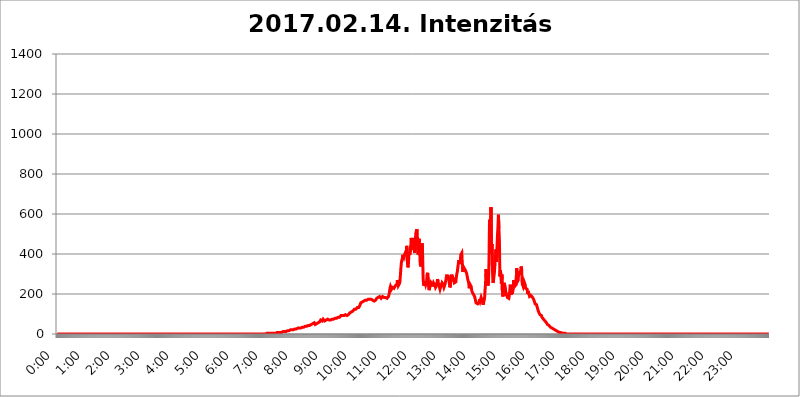
| Category | 2017.02.14. Intenzitás [W/m^2] |
|---|---|
| 0.0 | 0 |
| 0.0006944444444444445 | 0 |
| 0.001388888888888889 | 0 |
| 0.0020833333333333333 | 0 |
| 0.002777777777777778 | 0 |
| 0.003472222222222222 | 0 |
| 0.004166666666666667 | 0 |
| 0.004861111111111111 | 0 |
| 0.005555555555555556 | 0 |
| 0.0062499999999999995 | 0 |
| 0.006944444444444444 | 0 |
| 0.007638888888888889 | 0 |
| 0.008333333333333333 | 0 |
| 0.009027777777777779 | 0 |
| 0.009722222222222222 | 0 |
| 0.010416666666666666 | 0 |
| 0.011111111111111112 | 0 |
| 0.011805555555555555 | 0 |
| 0.012499999999999999 | 0 |
| 0.013194444444444444 | 0 |
| 0.013888888888888888 | 0 |
| 0.014583333333333332 | 0 |
| 0.015277777777777777 | 0 |
| 0.015972222222222224 | 0 |
| 0.016666666666666666 | 0 |
| 0.017361111111111112 | 0 |
| 0.018055555555555557 | 0 |
| 0.01875 | 0 |
| 0.019444444444444445 | 0 |
| 0.02013888888888889 | 0 |
| 0.020833333333333332 | 0 |
| 0.02152777777777778 | 0 |
| 0.022222222222222223 | 0 |
| 0.02291666666666667 | 0 |
| 0.02361111111111111 | 0 |
| 0.024305555555555556 | 0 |
| 0.024999999999999998 | 0 |
| 0.025694444444444447 | 0 |
| 0.02638888888888889 | 0 |
| 0.027083333333333334 | 0 |
| 0.027777777777777776 | 0 |
| 0.02847222222222222 | 0 |
| 0.029166666666666664 | 0 |
| 0.029861111111111113 | 0 |
| 0.030555555555555555 | 0 |
| 0.03125 | 0 |
| 0.03194444444444445 | 0 |
| 0.03263888888888889 | 0 |
| 0.03333333333333333 | 0 |
| 0.034027777777777775 | 0 |
| 0.034722222222222224 | 0 |
| 0.035416666666666666 | 0 |
| 0.036111111111111115 | 0 |
| 0.03680555555555556 | 0 |
| 0.0375 | 0 |
| 0.03819444444444444 | 0 |
| 0.03888888888888889 | 0 |
| 0.03958333333333333 | 0 |
| 0.04027777777777778 | 0 |
| 0.04097222222222222 | 0 |
| 0.041666666666666664 | 0 |
| 0.042361111111111106 | 0 |
| 0.04305555555555556 | 0 |
| 0.043750000000000004 | 0 |
| 0.044444444444444446 | 0 |
| 0.04513888888888889 | 0 |
| 0.04583333333333334 | 0 |
| 0.04652777777777778 | 0 |
| 0.04722222222222222 | 0 |
| 0.04791666666666666 | 0 |
| 0.04861111111111111 | 0 |
| 0.049305555555555554 | 0 |
| 0.049999999999999996 | 0 |
| 0.05069444444444445 | 0 |
| 0.051388888888888894 | 0 |
| 0.052083333333333336 | 0 |
| 0.05277777777777778 | 0 |
| 0.05347222222222222 | 0 |
| 0.05416666666666667 | 0 |
| 0.05486111111111111 | 0 |
| 0.05555555555555555 | 0 |
| 0.05625 | 0 |
| 0.05694444444444444 | 0 |
| 0.057638888888888885 | 0 |
| 0.05833333333333333 | 0 |
| 0.05902777777777778 | 0 |
| 0.059722222222222225 | 0 |
| 0.06041666666666667 | 0 |
| 0.061111111111111116 | 0 |
| 0.06180555555555556 | 0 |
| 0.0625 | 0 |
| 0.06319444444444444 | 0 |
| 0.06388888888888888 | 0 |
| 0.06458333333333334 | 0 |
| 0.06527777777777778 | 0 |
| 0.06597222222222222 | 0 |
| 0.06666666666666667 | 0 |
| 0.06736111111111111 | 0 |
| 0.06805555555555555 | 0 |
| 0.06874999999999999 | 0 |
| 0.06944444444444443 | 0 |
| 0.07013888888888889 | 0 |
| 0.07083333333333333 | 0 |
| 0.07152777777777779 | 0 |
| 0.07222222222222223 | 0 |
| 0.07291666666666667 | 0 |
| 0.07361111111111111 | 0 |
| 0.07430555555555556 | 0 |
| 0.075 | 0 |
| 0.07569444444444444 | 0 |
| 0.0763888888888889 | 0 |
| 0.07708333333333334 | 0 |
| 0.07777777777777778 | 0 |
| 0.07847222222222222 | 0 |
| 0.07916666666666666 | 0 |
| 0.0798611111111111 | 0 |
| 0.08055555555555556 | 0 |
| 0.08125 | 0 |
| 0.08194444444444444 | 0 |
| 0.08263888888888889 | 0 |
| 0.08333333333333333 | 0 |
| 0.08402777777777777 | 0 |
| 0.08472222222222221 | 0 |
| 0.08541666666666665 | 0 |
| 0.08611111111111112 | 0 |
| 0.08680555555555557 | 0 |
| 0.08750000000000001 | 0 |
| 0.08819444444444445 | 0 |
| 0.08888888888888889 | 0 |
| 0.08958333333333333 | 0 |
| 0.09027777777777778 | 0 |
| 0.09097222222222222 | 0 |
| 0.09166666666666667 | 0 |
| 0.09236111111111112 | 0 |
| 0.09305555555555556 | 0 |
| 0.09375 | 0 |
| 0.09444444444444444 | 0 |
| 0.09513888888888888 | 0 |
| 0.09583333333333333 | 0 |
| 0.09652777777777777 | 0 |
| 0.09722222222222222 | 0 |
| 0.09791666666666667 | 0 |
| 0.09861111111111111 | 0 |
| 0.09930555555555555 | 0 |
| 0.09999999999999999 | 0 |
| 0.10069444444444443 | 0 |
| 0.1013888888888889 | 0 |
| 0.10208333333333335 | 0 |
| 0.10277777777777779 | 0 |
| 0.10347222222222223 | 0 |
| 0.10416666666666667 | 0 |
| 0.10486111111111111 | 0 |
| 0.10555555555555556 | 0 |
| 0.10625 | 0 |
| 0.10694444444444444 | 0 |
| 0.1076388888888889 | 0 |
| 0.10833333333333334 | 0 |
| 0.10902777777777778 | 0 |
| 0.10972222222222222 | 0 |
| 0.1111111111111111 | 0 |
| 0.11180555555555556 | 0 |
| 0.11180555555555556 | 0 |
| 0.1125 | 0 |
| 0.11319444444444444 | 0 |
| 0.11388888888888889 | 0 |
| 0.11458333333333333 | 0 |
| 0.11527777777777777 | 0 |
| 0.11597222222222221 | 0 |
| 0.11666666666666665 | 0 |
| 0.1173611111111111 | 0 |
| 0.11805555555555557 | 0 |
| 0.11944444444444445 | 0 |
| 0.12013888888888889 | 0 |
| 0.12083333333333333 | 0 |
| 0.12152777777777778 | 0 |
| 0.12222222222222223 | 0 |
| 0.12291666666666667 | 0 |
| 0.12291666666666667 | 0 |
| 0.12361111111111112 | 0 |
| 0.12430555555555556 | 0 |
| 0.125 | 0 |
| 0.12569444444444444 | 0 |
| 0.12638888888888888 | 0 |
| 0.12708333333333333 | 0 |
| 0.16875 | 0 |
| 0.12847222222222224 | 0 |
| 0.12916666666666668 | 0 |
| 0.12986111111111112 | 0 |
| 0.13055555555555556 | 0 |
| 0.13125 | 0 |
| 0.13194444444444445 | 0 |
| 0.1326388888888889 | 0 |
| 0.13333333333333333 | 0 |
| 0.13402777777777777 | 0 |
| 0.13402777777777777 | 0 |
| 0.13472222222222222 | 0 |
| 0.13541666666666666 | 0 |
| 0.1361111111111111 | 0 |
| 0.13749999999999998 | 0 |
| 0.13819444444444443 | 0 |
| 0.1388888888888889 | 0 |
| 0.13958333333333334 | 0 |
| 0.14027777777777778 | 0 |
| 0.14097222222222222 | 0 |
| 0.14166666666666666 | 0 |
| 0.1423611111111111 | 0 |
| 0.14305555555555557 | 0 |
| 0.14375000000000002 | 0 |
| 0.14444444444444446 | 0 |
| 0.1451388888888889 | 0 |
| 0.1451388888888889 | 0 |
| 0.14652777777777778 | 0 |
| 0.14722222222222223 | 0 |
| 0.14791666666666667 | 0 |
| 0.1486111111111111 | 0 |
| 0.14930555555555555 | 0 |
| 0.15 | 0 |
| 0.15069444444444444 | 0 |
| 0.15138888888888888 | 0 |
| 0.15208333333333332 | 0 |
| 0.15277777777777776 | 0 |
| 0.15347222222222223 | 0 |
| 0.15416666666666667 | 0 |
| 0.15486111111111112 | 0 |
| 0.15555555555555556 | 0 |
| 0.15625 | 0 |
| 0.15694444444444444 | 0 |
| 0.15763888888888888 | 0 |
| 0.15833333333333333 | 0 |
| 0.15902777777777777 | 0 |
| 0.15972222222222224 | 0 |
| 0.16041666666666668 | 0 |
| 0.16111111111111112 | 0 |
| 0.16180555555555556 | 0 |
| 0.1625 | 0 |
| 0.16319444444444445 | 0 |
| 0.1638888888888889 | 0 |
| 0.16458333333333333 | 0 |
| 0.16527777777777777 | 0 |
| 0.16597222222222222 | 0 |
| 0.16666666666666666 | 0 |
| 0.1673611111111111 | 0 |
| 0.16805555555555554 | 0 |
| 0.16874999999999998 | 0 |
| 0.16944444444444443 | 0 |
| 0.17013888888888887 | 0 |
| 0.1708333333333333 | 0 |
| 0.17152777777777775 | 0 |
| 0.17222222222222225 | 0 |
| 0.1729166666666667 | 0 |
| 0.17361111111111113 | 0 |
| 0.17430555555555557 | 0 |
| 0.17500000000000002 | 0 |
| 0.17569444444444446 | 0 |
| 0.1763888888888889 | 0 |
| 0.17708333333333334 | 0 |
| 0.17777777777777778 | 0 |
| 0.17847222222222223 | 0 |
| 0.17916666666666667 | 0 |
| 0.1798611111111111 | 0 |
| 0.18055555555555555 | 0 |
| 0.18125 | 0 |
| 0.18194444444444444 | 0 |
| 0.1826388888888889 | 0 |
| 0.18333333333333335 | 0 |
| 0.1840277777777778 | 0 |
| 0.18472222222222223 | 0 |
| 0.18541666666666667 | 0 |
| 0.18611111111111112 | 0 |
| 0.18680555555555556 | 0 |
| 0.1875 | 0 |
| 0.18819444444444444 | 0 |
| 0.18888888888888888 | 0 |
| 0.18958333333333333 | 0 |
| 0.19027777777777777 | 0 |
| 0.1909722222222222 | 0 |
| 0.19166666666666665 | 0 |
| 0.19236111111111112 | 0 |
| 0.19305555555555554 | 0 |
| 0.19375 | 0 |
| 0.19444444444444445 | 0 |
| 0.1951388888888889 | 0 |
| 0.19583333333333333 | 0 |
| 0.19652777777777777 | 0 |
| 0.19722222222222222 | 0 |
| 0.19791666666666666 | 0 |
| 0.1986111111111111 | 0 |
| 0.19930555555555554 | 0 |
| 0.19999999999999998 | 0 |
| 0.20069444444444443 | 0 |
| 0.20138888888888887 | 0 |
| 0.2020833333333333 | 0 |
| 0.2027777777777778 | 0 |
| 0.2034722222222222 | 0 |
| 0.2041666666666667 | 0 |
| 0.20486111111111113 | 0 |
| 0.20555555555555557 | 0 |
| 0.20625000000000002 | 0 |
| 0.20694444444444446 | 0 |
| 0.2076388888888889 | 0 |
| 0.20833333333333334 | 0 |
| 0.20902777777777778 | 0 |
| 0.20972222222222223 | 0 |
| 0.21041666666666667 | 0 |
| 0.2111111111111111 | 0 |
| 0.21180555555555555 | 0 |
| 0.2125 | 0 |
| 0.21319444444444444 | 0 |
| 0.2138888888888889 | 0 |
| 0.21458333333333335 | 0 |
| 0.2152777777777778 | 0 |
| 0.21597222222222223 | 0 |
| 0.21666666666666667 | 0 |
| 0.21736111111111112 | 0 |
| 0.21805555555555556 | 0 |
| 0.21875 | 0 |
| 0.21944444444444444 | 0 |
| 0.22013888888888888 | 0 |
| 0.22083333333333333 | 0 |
| 0.22152777777777777 | 0 |
| 0.2222222222222222 | 0 |
| 0.22291666666666665 | 0 |
| 0.2236111111111111 | 0 |
| 0.22430555555555556 | 0 |
| 0.225 | 0 |
| 0.22569444444444445 | 0 |
| 0.2263888888888889 | 0 |
| 0.22708333333333333 | 0 |
| 0.22777777777777777 | 0 |
| 0.22847222222222222 | 0 |
| 0.22916666666666666 | 0 |
| 0.2298611111111111 | 0 |
| 0.23055555555555554 | 0 |
| 0.23124999999999998 | 0 |
| 0.23194444444444443 | 0 |
| 0.23263888888888887 | 0 |
| 0.2333333333333333 | 0 |
| 0.2340277777777778 | 0 |
| 0.2347222222222222 | 0 |
| 0.2354166666666667 | 0 |
| 0.23611111111111113 | 0 |
| 0.23680555555555557 | 0 |
| 0.23750000000000002 | 0 |
| 0.23819444444444446 | 0 |
| 0.2388888888888889 | 0 |
| 0.23958333333333334 | 0 |
| 0.24027777777777778 | 0 |
| 0.24097222222222223 | 0 |
| 0.24166666666666667 | 0 |
| 0.2423611111111111 | 0 |
| 0.24305555555555555 | 0 |
| 0.24375 | 0 |
| 0.24444444444444446 | 0 |
| 0.24513888888888888 | 0 |
| 0.24583333333333335 | 0 |
| 0.2465277777777778 | 0 |
| 0.24722222222222223 | 0 |
| 0.24791666666666667 | 0 |
| 0.24861111111111112 | 0 |
| 0.24930555555555556 | 0 |
| 0.25 | 0 |
| 0.25069444444444444 | 0 |
| 0.2513888888888889 | 0 |
| 0.2520833333333333 | 0 |
| 0.25277777777777777 | 0 |
| 0.2534722222222222 | 0 |
| 0.25416666666666665 | 0 |
| 0.2548611111111111 | 0 |
| 0.2555555555555556 | 0 |
| 0.25625000000000003 | 0 |
| 0.2569444444444445 | 0 |
| 0.2576388888888889 | 0 |
| 0.25833333333333336 | 0 |
| 0.2590277777777778 | 0 |
| 0.25972222222222224 | 0 |
| 0.2604166666666667 | 0 |
| 0.2611111111111111 | 0 |
| 0.26180555555555557 | 0 |
| 0.2625 | 0 |
| 0.26319444444444445 | 0 |
| 0.2638888888888889 | 0 |
| 0.26458333333333334 | 0 |
| 0.2652777777777778 | 0 |
| 0.2659722222222222 | 0 |
| 0.26666666666666666 | 0 |
| 0.2673611111111111 | 0 |
| 0.26805555555555555 | 0 |
| 0.26875 | 0 |
| 0.26944444444444443 | 0 |
| 0.2701388888888889 | 0 |
| 0.2708333333333333 | 0 |
| 0.27152777777777776 | 0 |
| 0.2722222222222222 | 0 |
| 0.27291666666666664 | 0 |
| 0.2736111111111111 | 0 |
| 0.2743055555555555 | 0 |
| 0.27499999999999997 | 0 |
| 0.27569444444444446 | 0 |
| 0.27638888888888885 | 0 |
| 0.27708333333333335 | 0 |
| 0.2777777777777778 | 0 |
| 0.27847222222222223 | 0 |
| 0.2791666666666667 | 0 |
| 0.2798611111111111 | 0 |
| 0.28055555555555556 | 0 |
| 0.28125 | 0 |
| 0.28194444444444444 | 0 |
| 0.2826388888888889 | 0 |
| 0.2833333333333333 | 0 |
| 0.28402777777777777 | 0 |
| 0.2847222222222222 | 0 |
| 0.28541666666666665 | 0 |
| 0.28611111111111115 | 0 |
| 0.28680555555555554 | 0 |
| 0.28750000000000003 | 0 |
| 0.2881944444444445 | 0 |
| 0.2888888888888889 | 0 |
| 0.28958333333333336 | 0 |
| 0.2902777777777778 | 0 |
| 0.29097222222222224 | 0 |
| 0.2916666666666667 | 0 |
| 0.2923611111111111 | 0 |
| 0.29305555555555557 | 0 |
| 0.29375 | 3.525 |
| 0.29444444444444445 | 0 |
| 0.2951388888888889 | 0 |
| 0.29583333333333334 | 3.525 |
| 0.2965277777777778 | 3.525 |
| 0.2972222222222222 | 3.525 |
| 0.29791666666666666 | 3.525 |
| 0.2986111111111111 | 3.525 |
| 0.29930555555555555 | 3.525 |
| 0.3 | 3.525 |
| 0.30069444444444443 | 3.525 |
| 0.3013888888888889 | 3.525 |
| 0.3020833333333333 | 3.525 |
| 0.30277777777777776 | 3.525 |
| 0.3034722222222222 | 3.525 |
| 0.30416666666666664 | 3.525 |
| 0.3048611111111111 | 3.525 |
| 0.3055555555555555 | 3.525 |
| 0.30624999999999997 | 3.525 |
| 0.3069444444444444 | 3.525 |
| 0.3076388888888889 | 3.525 |
| 0.30833333333333335 | 7.887 |
| 0.3090277777777778 | 7.887 |
| 0.30972222222222223 | 7.887 |
| 0.3104166666666667 | 7.887 |
| 0.3111111111111111 | 7.887 |
| 0.31180555555555556 | 7.887 |
| 0.3125 | 7.887 |
| 0.31319444444444444 | 7.887 |
| 0.3138888888888889 | 7.887 |
| 0.3145833333333333 | 7.887 |
| 0.31527777777777777 | 7.887 |
| 0.3159722222222222 | 12.257 |
| 0.31666666666666665 | 12.257 |
| 0.31736111111111115 | 12.257 |
| 0.31805555555555554 | 12.257 |
| 0.31875000000000003 | 12.257 |
| 0.3194444444444445 | 12.257 |
| 0.3201388888888889 | 12.257 |
| 0.32083333333333336 | 12.257 |
| 0.3215277777777778 | 16.636 |
| 0.32222222222222224 | 16.636 |
| 0.3229166666666667 | 16.636 |
| 0.3236111111111111 | 16.636 |
| 0.32430555555555557 | 16.636 |
| 0.325 | 16.636 |
| 0.32569444444444445 | 21.024 |
| 0.3263888888888889 | 16.636 |
| 0.32708333333333334 | 21.024 |
| 0.3277777777777778 | 21.024 |
| 0.3284722222222222 | 21.024 |
| 0.32916666666666666 | 21.024 |
| 0.3298611111111111 | 21.024 |
| 0.33055555555555555 | 21.024 |
| 0.33125 | 21.024 |
| 0.33194444444444443 | 25.419 |
| 0.3326388888888889 | 25.419 |
| 0.3333333333333333 | 25.419 |
| 0.3340277777777778 | 25.419 |
| 0.3347222222222222 | 25.419 |
| 0.3354166666666667 | 25.419 |
| 0.3361111111111111 | 25.419 |
| 0.3368055555555556 | 29.823 |
| 0.33749999999999997 | 29.823 |
| 0.33819444444444446 | 29.823 |
| 0.33888888888888885 | 29.823 |
| 0.33958333333333335 | 29.823 |
| 0.34027777777777773 | 29.823 |
| 0.34097222222222223 | 29.823 |
| 0.3416666666666666 | 29.823 |
| 0.3423611111111111 | 29.823 |
| 0.3430555555555555 | 29.823 |
| 0.34375 | 34.234 |
| 0.3444444444444445 | 34.234 |
| 0.3451388888888889 | 34.234 |
| 0.3458333333333334 | 34.234 |
| 0.34652777777777777 | 38.653 |
| 0.34722222222222227 | 38.653 |
| 0.34791666666666665 | 38.653 |
| 0.34861111111111115 | 38.653 |
| 0.34930555555555554 | 38.653 |
| 0.35000000000000003 | 38.653 |
| 0.3506944444444444 | 38.653 |
| 0.3513888888888889 | 38.653 |
| 0.3520833333333333 | 43.079 |
| 0.3527777777777778 | 43.079 |
| 0.3534722222222222 | 43.079 |
| 0.3541666666666667 | 43.079 |
| 0.3548611111111111 | 43.079 |
| 0.35555555555555557 | 43.079 |
| 0.35625 | 47.511 |
| 0.35694444444444445 | 51.951 |
| 0.3576388888888889 | 51.951 |
| 0.35833333333333334 | 51.951 |
| 0.3590277777777778 | 51.951 |
| 0.3597222222222222 | 51.951 |
| 0.36041666666666666 | 56.398 |
| 0.3611111111111111 | 51.951 |
| 0.36180555555555555 | 47.511 |
| 0.3625 | 47.511 |
| 0.36319444444444443 | 47.511 |
| 0.3638888888888889 | 51.951 |
| 0.3645833333333333 | 56.398 |
| 0.3652777777777778 | 56.398 |
| 0.3659722222222222 | 56.398 |
| 0.3666666666666667 | 60.85 |
| 0.3673611111111111 | 60.85 |
| 0.3680555555555556 | 60.85 |
| 0.36874999999999997 | 65.31 |
| 0.36944444444444446 | 69.775 |
| 0.37013888888888885 | 65.31 |
| 0.37083333333333335 | 65.31 |
| 0.37152777777777773 | 65.31 |
| 0.37222222222222223 | 65.31 |
| 0.3729166666666666 | 74.246 |
| 0.3736111111111111 | 74.246 |
| 0.3743055555555555 | 69.775 |
| 0.375 | 65.31 |
| 0.3756944444444445 | 65.31 |
| 0.3763888888888889 | 69.775 |
| 0.3770833333333334 | 69.775 |
| 0.37777777777777777 | 69.775 |
| 0.37847222222222227 | 74.246 |
| 0.37916666666666665 | 74.246 |
| 0.37986111111111115 | 69.775 |
| 0.38055555555555554 | 69.775 |
| 0.38125000000000003 | 69.775 |
| 0.3819444444444444 | 69.775 |
| 0.3826388888888889 | 69.775 |
| 0.3833333333333333 | 69.775 |
| 0.3840277777777778 | 69.775 |
| 0.3847222222222222 | 74.246 |
| 0.3854166666666667 | 74.246 |
| 0.3861111111111111 | 74.246 |
| 0.38680555555555557 | 74.246 |
| 0.3875 | 74.246 |
| 0.38819444444444445 | 74.246 |
| 0.3888888888888889 | 78.722 |
| 0.38958333333333334 | 78.722 |
| 0.3902777777777778 | 78.722 |
| 0.3909722222222222 | 78.722 |
| 0.39166666666666666 | 78.722 |
| 0.3923611111111111 | 78.722 |
| 0.39305555555555555 | 83.205 |
| 0.39375 | 83.205 |
| 0.39444444444444443 | 83.205 |
| 0.3951388888888889 | 83.205 |
| 0.3958333333333333 | 83.205 |
| 0.3965277777777778 | 83.205 |
| 0.3972222222222222 | 87.692 |
| 0.3979166666666667 | 92.184 |
| 0.3986111111111111 | 92.184 |
| 0.3993055555555556 | 92.184 |
| 0.39999999999999997 | 92.184 |
| 0.40069444444444446 | 92.184 |
| 0.40138888888888885 | 92.184 |
| 0.40208333333333335 | 92.184 |
| 0.40277777777777773 | 96.682 |
| 0.40347222222222223 | 96.682 |
| 0.4041666666666666 | 96.682 |
| 0.4048611111111111 | 96.682 |
| 0.4055555555555555 | 92.184 |
| 0.40625 | 92.184 |
| 0.4069444444444445 | 96.682 |
| 0.4076388888888889 | 96.682 |
| 0.4083333333333334 | 96.682 |
| 0.40902777777777777 | 96.682 |
| 0.40972222222222227 | 101.184 |
| 0.41041666666666665 | 105.69 |
| 0.41111111111111115 | 105.69 |
| 0.41180555555555554 | 110.201 |
| 0.41250000000000003 | 110.201 |
| 0.4131944444444444 | 110.201 |
| 0.4138888888888889 | 114.716 |
| 0.4145833333333333 | 114.716 |
| 0.4152777777777778 | 114.716 |
| 0.4159722222222222 | 119.235 |
| 0.4166666666666667 | 123.758 |
| 0.4173611111111111 | 123.758 |
| 0.41805555555555557 | 123.758 |
| 0.41875 | 123.758 |
| 0.41944444444444445 | 123.758 |
| 0.4201388888888889 | 128.284 |
| 0.42083333333333334 | 132.814 |
| 0.4215277777777778 | 137.347 |
| 0.4222222222222222 | 137.347 |
| 0.42291666666666666 | 132.814 |
| 0.4236111111111111 | 137.347 |
| 0.42430555555555555 | 141.884 |
| 0.425 | 146.423 |
| 0.42569444444444443 | 155.509 |
| 0.4263888888888889 | 160.056 |
| 0.4270833333333333 | 160.056 |
| 0.4277777777777778 | 160.056 |
| 0.4284722222222222 | 164.605 |
| 0.4291666666666667 | 164.605 |
| 0.4298611111111111 | 164.605 |
| 0.4305555555555556 | 164.605 |
| 0.43124999999999997 | 164.605 |
| 0.43194444444444446 | 169.156 |
| 0.43263888888888885 | 169.156 |
| 0.43333333333333335 | 164.605 |
| 0.43402777777777773 | 169.156 |
| 0.43472222222222223 | 169.156 |
| 0.4354166666666666 | 173.709 |
| 0.4361111111111111 | 173.709 |
| 0.4368055555555555 | 173.709 |
| 0.4375 | 173.709 |
| 0.4381944444444445 | 173.709 |
| 0.4388888888888889 | 173.709 |
| 0.4395833333333334 | 173.709 |
| 0.44027777777777777 | 173.709 |
| 0.44097222222222227 | 178.264 |
| 0.44166666666666665 | 173.709 |
| 0.44236111111111115 | 169.156 |
| 0.44305555555555554 | 169.156 |
| 0.44375000000000003 | 164.605 |
| 0.4444444444444444 | 164.605 |
| 0.4451388888888889 | 164.605 |
| 0.4458333333333333 | 169.156 |
| 0.4465277777777778 | 169.156 |
| 0.4472222222222222 | 169.156 |
| 0.4479166666666667 | 178.264 |
| 0.4486111111111111 | 178.264 |
| 0.44930555555555557 | 182.82 |
| 0.45 | 182.82 |
| 0.45069444444444445 | 187.378 |
| 0.4513888888888889 | 187.378 |
| 0.45208333333333334 | 187.378 |
| 0.4527777777777778 | 187.378 |
| 0.4534722222222222 | 187.378 |
| 0.45416666666666666 | 178.264 |
| 0.4548611111111111 | 182.82 |
| 0.45555555555555555 | 182.82 |
| 0.45625 | 187.378 |
| 0.45694444444444443 | 182.82 |
| 0.4576388888888889 | 182.82 |
| 0.4583333333333333 | 182.82 |
| 0.4590277777777778 | 178.264 |
| 0.4597222222222222 | 178.264 |
| 0.4604166666666667 | 182.82 |
| 0.4611111111111111 | 182.82 |
| 0.4618055555555556 | 178.264 |
| 0.46249999999999997 | 178.264 |
| 0.46319444444444446 | 178.264 |
| 0.46388888888888885 | 182.82 |
| 0.46458333333333335 | 187.378 |
| 0.46527777777777773 | 196.497 |
| 0.46597222222222223 | 210.182 |
| 0.4666666666666666 | 228.436 |
| 0.4673611111111111 | 237.564 |
| 0.4680555555555555 | 233 |
| 0.46875 | 223.873 |
| 0.4694444444444445 | 223.873 |
| 0.4701388888888889 | 233 |
| 0.4708333333333334 | 237.564 |
| 0.47152777777777777 | 233 |
| 0.47222222222222227 | 228.436 |
| 0.47291666666666665 | 233 |
| 0.47361111111111115 | 233 |
| 0.47430555555555554 | 242.127 |
| 0.47500000000000003 | 246.689 |
| 0.4756944444444444 | 242.127 |
| 0.4763888888888889 | 246.689 |
| 0.4770833333333333 | 269.49 |
| 0.4777777777777778 | 260.373 |
| 0.4784722222222222 | 242.127 |
| 0.4791666666666667 | 246.689 |
| 0.4798611111111111 | 251.251 |
| 0.48055555555555557 | 260.373 |
| 0.48125 | 292.259 |
| 0.48194444444444445 | 328.584 |
| 0.4826388888888889 | 355.712 |
| 0.48333333333333334 | 369.23 |
| 0.4840277777777778 | 378.224 |
| 0.4847222222222222 | 396.164 |
| 0.48541666666666666 | 396.164 |
| 0.4861111111111111 | 382.715 |
| 0.48680555555555555 | 387.202 |
| 0.4875 | 400.638 |
| 0.48819444444444443 | 405.108 |
| 0.4888888888888889 | 396.164 |
| 0.4895833333333333 | 418.492 |
| 0.4902777777777778 | 440.702 |
| 0.4909722222222222 | 369.23 |
| 0.4916666666666667 | 333.113 |
| 0.4923611111111111 | 342.162 |
| 0.4930555555555556 | 387.202 |
| 0.49374999999999997 | 409.574 |
| 0.49444444444444446 | 396.164 |
| 0.49513888888888885 | 391.685 |
| 0.49583333333333335 | 440.702 |
| 0.49652777777777773 | 480.356 |
| 0.49722222222222223 | 436.27 |
| 0.4979166666666666 | 431.833 |
| 0.4986111111111111 | 480.356 |
| 0.4993055555555555 | 449.551 |
| 0.5 | 418.492 |
| 0.5006944444444444 | 427.39 |
| 0.5013888888888889 | 405.108 |
| 0.5020833333333333 | 431.833 |
| 0.5027777777777778 | 502.192 |
| 0.5034722222222222 | 502.192 |
| 0.5041666666666667 | 523.88 |
| 0.5048611111111111 | 515.223 |
| 0.5055555555555555 | 422.943 |
| 0.50625 | 396.164 |
| 0.5069444444444444 | 440.702 |
| 0.5076388888888889 | 475.972 |
| 0.5083333333333333 | 414.035 |
| 0.5090277777777777 | 351.198 |
| 0.5097222222222222 | 337.639 |
| 0.5104166666666666 | 351.198 |
| 0.5111111111111112 | 373.729 |
| 0.5118055555555555 | 453.968 |
| 0.5125000000000001 | 387.202 |
| 0.5131944444444444 | 278.603 |
| 0.513888888888889 | 242.127 |
| 0.5145833333333333 | 251.251 |
| 0.5152777777777778 | 264.932 |
| 0.5159722222222222 | 264.932 |
| 0.5166666666666667 | 246.689 |
| 0.517361111111111 | 242.127 |
| 0.5180555555555556 | 264.932 |
| 0.5187499999999999 | 296.808 |
| 0.5194444444444445 | 305.898 |
| 0.5201388888888888 | 269.49 |
| 0.5208333333333334 | 237.564 |
| 0.5215277777777778 | 219.309 |
| 0.5222222222222223 | 223.873 |
| 0.5229166666666667 | 242.127 |
| 0.5236111111111111 | 260.373 |
| 0.5243055555555556 | 264.932 |
| 0.525 | 264.932 |
| 0.5256944444444445 | 251.251 |
| 0.5263888888888889 | 237.564 |
| 0.5270833333333333 | 242.127 |
| 0.5277777777777778 | 255.813 |
| 0.5284722222222222 | 260.373 |
| 0.5291666666666667 | 255.813 |
| 0.5298611111111111 | 242.127 |
| 0.5305555555555556 | 233 |
| 0.53125 | 233 |
| 0.5319444444444444 | 242.127 |
| 0.5326388888888889 | 255.813 |
| 0.5333333333333333 | 274.047 |
| 0.5340277777777778 | 264.932 |
| 0.5347222222222222 | 251.251 |
| 0.5354166666666667 | 242.127 |
| 0.5361111111111111 | 233 |
| 0.5368055555555555 | 223.873 |
| 0.5375 | 228.436 |
| 0.5381944444444444 | 242.127 |
| 0.5388888888888889 | 246.689 |
| 0.5395833333333333 | 255.813 |
| 0.5402777777777777 | 255.813 |
| 0.5409722222222222 | 251.251 |
| 0.5416666666666666 | 242.127 |
| 0.5423611111111112 | 233 |
| 0.5430555555555555 | 233 |
| 0.5437500000000001 | 246.689 |
| 0.5444444444444444 | 260.373 |
| 0.545138888888889 | 269.49 |
| 0.5458333333333333 | 287.709 |
| 0.5465277777777778 | 296.808 |
| 0.5472222222222222 | 283.156 |
| 0.5479166666666667 | 292.259 |
| 0.548611111111111 | 292.259 |
| 0.5493055555555556 | 269.49 |
| 0.5499999999999999 | 251.251 |
| 0.5506944444444445 | 233 |
| 0.5513888888888888 | 242.127 |
| 0.5520833333333334 | 274.047 |
| 0.5527777777777778 | 296.808 |
| 0.5534722222222223 | 274.047 |
| 0.5541666666666667 | 269.49 |
| 0.5548611111111111 | 283.156 |
| 0.5555555555555556 | 278.603 |
| 0.55625 | 269.49 |
| 0.5569444444444445 | 255.813 |
| 0.5576388888888889 | 251.251 |
| 0.5583333333333333 | 251.251 |
| 0.5590277777777778 | 260.373 |
| 0.5597222222222222 | 283.156 |
| 0.5604166666666667 | 301.354 |
| 0.5611111111111111 | 310.44 |
| 0.5618055555555556 | 333.113 |
| 0.5625 | 351.198 |
| 0.5631944444444444 | 369.23 |
| 0.5638888888888889 | 351.198 |
| 0.5645833333333333 | 346.682 |
| 0.5652777777777778 | 364.728 |
| 0.5659722222222222 | 396.164 |
| 0.5666666666666667 | 400.638 |
| 0.5673611111111111 | 405.108 |
| 0.5680555555555555 | 355.712 |
| 0.56875 | 310.44 |
| 0.5694444444444444 | 305.898 |
| 0.5701388888888889 | 333.113 |
| 0.5708333333333333 | 333.113 |
| 0.5715277777777777 | 324.052 |
| 0.5722222222222222 | 319.517 |
| 0.5729166666666666 | 314.98 |
| 0.5736111111111112 | 310.44 |
| 0.5743055555555555 | 301.354 |
| 0.5750000000000001 | 301.354 |
| 0.5756944444444444 | 274.047 |
| 0.576388888888889 | 269.49 |
| 0.5770833333333333 | 255.813 |
| 0.5777777777777778 | 228.436 |
| 0.5784722222222222 | 237.564 |
| 0.5791666666666667 | 246.689 |
| 0.579861111111111 | 242.127 |
| 0.5805555555555556 | 237.564 |
| 0.5812499999999999 | 219.309 |
| 0.5819444444444445 | 210.182 |
| 0.5826388888888888 | 210.182 |
| 0.5833333333333334 | 205.62 |
| 0.5840277777777778 | 196.497 |
| 0.5847222222222223 | 191.937 |
| 0.5854166666666667 | 187.378 |
| 0.5861111111111111 | 182.82 |
| 0.5868055555555556 | 164.605 |
| 0.5875 | 155.509 |
| 0.5881944444444445 | 150.964 |
| 0.5888888888888889 | 155.509 |
| 0.5895833333333333 | 150.964 |
| 0.5902777777777778 | 155.509 |
| 0.5909722222222222 | 150.964 |
| 0.5916666666666667 | 160.056 |
| 0.5923611111111111 | 173.709 |
| 0.5930555555555556 | 164.605 |
| 0.59375 | 164.605 |
| 0.5944444444444444 | 182.82 |
| 0.5951388888888889 | 182.82 |
| 0.5958333333333333 | 182.82 |
| 0.5965277777777778 | 160.056 |
| 0.5972222222222222 | 146.423 |
| 0.5979166666666667 | 155.509 |
| 0.5986111111111111 | 155.509 |
| 0.5993055555555555 | 178.264 |
| 0.6 | 219.309 |
| 0.6006944444444444 | 251.251 |
| 0.6013888888888889 | 324.052 |
| 0.6020833333333333 | 269.49 |
| 0.6027777777777777 | 260.373 |
| 0.6034722222222222 | 255.813 |
| 0.6041666666666666 | 242.127 |
| 0.6048611111111112 | 264.932 |
| 0.6055555555555555 | 369.23 |
| 0.6062500000000001 | 571.049 |
| 0.6069444444444444 | 440.702 |
| 0.607638888888889 | 431.833 |
| 0.6083333333333333 | 634.105 |
| 0.6090277777777778 | 400.638 |
| 0.6097222222222222 | 449.551 |
| 0.6104166666666667 | 314.98 |
| 0.611111111111111 | 255.813 |
| 0.6118055555555556 | 264.932 |
| 0.6124999999999999 | 287.709 |
| 0.6131944444444445 | 310.44 |
| 0.6138888888888888 | 346.682 |
| 0.6145833333333334 | 346.682 |
| 0.6152777777777778 | 422.943 |
| 0.6159722222222223 | 360.221 |
| 0.6166666666666667 | 422.943 |
| 0.6173611111111111 | 489.108 |
| 0.6180555555555556 | 532.513 |
| 0.61875 | 596.45 |
| 0.6194444444444445 | 528.2 |
| 0.6201388888888889 | 467.187 |
| 0.6208333333333333 | 287.709 |
| 0.6215277777777778 | 319.517 |
| 0.6222222222222222 | 292.259 |
| 0.6229166666666667 | 251.251 |
| 0.6236111111111111 | 296.808 |
| 0.6243055555555556 | 219.309 |
| 0.625 | 187.378 |
| 0.6256944444444444 | 191.937 |
| 0.6263888888888889 | 237.564 |
| 0.6270833333333333 | 255.813 |
| 0.6277777777777778 | 251.251 |
| 0.6284722222222222 | 219.309 |
| 0.6291666666666667 | 191.937 |
| 0.6298611111111111 | 201.058 |
| 0.6305555555555555 | 191.937 |
| 0.63125 | 182.82 |
| 0.6319444444444444 | 182.82 |
| 0.6326388888888889 | 178.264 |
| 0.6333333333333333 | 178.264 |
| 0.6340277777777777 | 191.937 |
| 0.6347222222222222 | 219.309 |
| 0.6354166666666666 | 246.689 |
| 0.6361111111111112 | 242.127 |
| 0.6368055555555555 | 196.497 |
| 0.6375000000000001 | 210.182 |
| 0.6381944444444444 | 201.058 |
| 0.638888888888889 | 205.62 |
| 0.6395833333333333 | 233 |
| 0.6402777777777778 | 269.49 |
| 0.6409722222222222 | 233 |
| 0.6416666666666667 | 260.373 |
| 0.642361111111111 | 251.251 |
| 0.6430555555555556 | 242.127 |
| 0.6437499999999999 | 278.603 |
| 0.6444444444444445 | 328.584 |
| 0.6451388888888888 | 260.373 |
| 0.6458333333333334 | 264.932 |
| 0.6465277777777778 | 269.49 |
| 0.6472222222222223 | 314.98 |
| 0.6479166666666667 | 296.808 |
| 0.6486111111111111 | 296.808 |
| 0.6493055555555556 | 296.808 |
| 0.65 | 314.98 |
| 0.6506944444444445 | 337.639 |
| 0.6513888888888889 | 319.517 |
| 0.6520833333333333 | 251.251 |
| 0.6527777777777778 | 251.251 |
| 0.6534722222222222 | 237.564 |
| 0.6541666666666667 | 237.564 |
| 0.6548611111111111 | 260.373 |
| 0.6555555555555556 | 260.373 |
| 0.65625 | 246.689 |
| 0.6569444444444444 | 228.436 |
| 0.6576388888888889 | 233 |
| 0.6583333333333333 | 223.873 |
| 0.6590277777777778 | 223.873 |
| 0.6597222222222222 | 201.058 |
| 0.6604166666666667 | 214.746 |
| 0.6611111111111111 | 214.746 |
| 0.6618055555555555 | 196.497 |
| 0.6625 | 187.378 |
| 0.6631944444444444 | 187.378 |
| 0.6638888888888889 | 187.378 |
| 0.6645833333333333 | 191.937 |
| 0.6652777777777777 | 191.937 |
| 0.6659722222222222 | 187.378 |
| 0.6666666666666666 | 182.82 |
| 0.6673611111111111 | 178.264 |
| 0.6680555555555556 | 173.709 |
| 0.6687500000000001 | 173.709 |
| 0.6694444444444444 | 160.056 |
| 0.6701388888888888 | 150.964 |
| 0.6708333333333334 | 150.964 |
| 0.6715277777777778 | 150.964 |
| 0.6722222222222222 | 146.423 |
| 0.6729166666666666 | 141.884 |
| 0.6736111111111112 | 128.284 |
| 0.6743055555555556 | 119.235 |
| 0.6749999999999999 | 114.716 |
| 0.6756944444444444 | 105.69 |
| 0.6763888888888889 | 101.184 |
| 0.6770833333333334 | 96.682 |
| 0.6777777777777777 | 92.184 |
| 0.6784722222222223 | 92.184 |
| 0.6791666666666667 | 92.184 |
| 0.6798611111111111 | 83.205 |
| 0.6805555555555555 | 83.205 |
| 0.68125 | 78.722 |
| 0.6819444444444445 | 74.246 |
| 0.6826388888888889 | 74.246 |
| 0.6833333333333332 | 69.775 |
| 0.6840277777777778 | 65.31 |
| 0.6847222222222222 | 65.31 |
| 0.6854166666666667 | 60.85 |
| 0.686111111111111 | 56.398 |
| 0.6868055555555556 | 51.951 |
| 0.6875 | 47.511 |
| 0.6881944444444444 | 47.511 |
| 0.688888888888889 | 43.079 |
| 0.6895833333333333 | 43.079 |
| 0.6902777777777778 | 38.653 |
| 0.6909722222222222 | 38.653 |
| 0.6916666666666668 | 34.234 |
| 0.6923611111111111 | 34.234 |
| 0.6930555555555555 | 29.823 |
| 0.69375 | 29.823 |
| 0.6944444444444445 | 29.823 |
| 0.6951388888888889 | 25.419 |
| 0.6958333333333333 | 25.419 |
| 0.6965277777777777 | 25.419 |
| 0.6972222222222223 | 21.024 |
| 0.6979166666666666 | 21.024 |
| 0.6986111111111111 | 21.024 |
| 0.6993055555555556 | 16.636 |
| 0.7000000000000001 | 16.636 |
| 0.7006944444444444 | 16.636 |
| 0.7013888888888888 | 12.257 |
| 0.7020833333333334 | 12.257 |
| 0.7027777777777778 | 12.257 |
| 0.7034722222222222 | 12.257 |
| 0.7041666666666666 | 7.887 |
| 0.7048611111111112 | 7.887 |
| 0.7055555555555556 | 7.887 |
| 0.7062499999999999 | 7.887 |
| 0.7069444444444444 | 3.525 |
| 0.7076388888888889 | 3.525 |
| 0.7083333333333334 | 3.525 |
| 0.7090277777777777 | 3.525 |
| 0.7097222222222223 | 3.525 |
| 0.7104166666666667 | 3.525 |
| 0.7111111111111111 | 3.525 |
| 0.7118055555555555 | 3.525 |
| 0.7125 | 3.525 |
| 0.7131944444444445 | 0 |
| 0.7138888888888889 | 0 |
| 0.7145833333333332 | 0 |
| 0.7152777777777778 | 0 |
| 0.7159722222222222 | 0 |
| 0.7166666666666667 | 0 |
| 0.717361111111111 | 0 |
| 0.7180555555555556 | 0 |
| 0.71875 | 0 |
| 0.7194444444444444 | 0 |
| 0.720138888888889 | 0 |
| 0.7208333333333333 | 0 |
| 0.7215277777777778 | 0 |
| 0.7222222222222222 | 0 |
| 0.7229166666666668 | 0 |
| 0.7236111111111111 | 0 |
| 0.7243055555555555 | 0 |
| 0.725 | 0 |
| 0.7256944444444445 | 0 |
| 0.7263888888888889 | 0 |
| 0.7270833333333333 | 0 |
| 0.7277777777777777 | 0 |
| 0.7284722222222223 | 0 |
| 0.7291666666666666 | 0 |
| 0.7298611111111111 | 0 |
| 0.7305555555555556 | 0 |
| 0.7312500000000001 | 0 |
| 0.7319444444444444 | 0 |
| 0.7326388888888888 | 0 |
| 0.7333333333333334 | 0 |
| 0.7340277777777778 | 0 |
| 0.7347222222222222 | 0 |
| 0.7354166666666666 | 0 |
| 0.7361111111111112 | 0 |
| 0.7368055555555556 | 0 |
| 0.7374999999999999 | 0 |
| 0.7381944444444444 | 0 |
| 0.7388888888888889 | 0 |
| 0.7395833333333334 | 0 |
| 0.7402777777777777 | 0 |
| 0.7409722222222223 | 0 |
| 0.7416666666666667 | 0 |
| 0.7423611111111111 | 0 |
| 0.7430555555555555 | 0 |
| 0.74375 | 0 |
| 0.7444444444444445 | 0 |
| 0.7451388888888889 | 0 |
| 0.7458333333333332 | 0 |
| 0.7465277777777778 | 0 |
| 0.7472222222222222 | 0 |
| 0.7479166666666667 | 0 |
| 0.748611111111111 | 0 |
| 0.7493055555555556 | 0 |
| 0.75 | 0 |
| 0.7506944444444444 | 0 |
| 0.751388888888889 | 0 |
| 0.7520833333333333 | 0 |
| 0.7527777777777778 | 0 |
| 0.7534722222222222 | 0 |
| 0.7541666666666668 | 0 |
| 0.7548611111111111 | 0 |
| 0.7555555555555555 | 0 |
| 0.75625 | 0 |
| 0.7569444444444445 | 0 |
| 0.7576388888888889 | 0 |
| 0.7583333333333333 | 0 |
| 0.7590277777777777 | 0 |
| 0.7597222222222223 | 0 |
| 0.7604166666666666 | 0 |
| 0.7611111111111111 | 0 |
| 0.7618055555555556 | 0 |
| 0.7625000000000001 | 0 |
| 0.7631944444444444 | 0 |
| 0.7638888888888888 | 0 |
| 0.7645833333333334 | 0 |
| 0.7652777777777778 | 0 |
| 0.7659722222222222 | 0 |
| 0.7666666666666666 | 0 |
| 0.7673611111111112 | 0 |
| 0.7680555555555556 | 0 |
| 0.7687499999999999 | 0 |
| 0.7694444444444444 | 0 |
| 0.7701388888888889 | 0 |
| 0.7708333333333334 | 0 |
| 0.7715277777777777 | 0 |
| 0.7722222222222223 | 0 |
| 0.7729166666666667 | 0 |
| 0.7736111111111111 | 0 |
| 0.7743055555555555 | 0 |
| 0.775 | 0 |
| 0.7756944444444445 | 0 |
| 0.7763888888888889 | 0 |
| 0.7770833333333332 | 0 |
| 0.7777777777777778 | 0 |
| 0.7784722222222222 | 0 |
| 0.7791666666666667 | 0 |
| 0.779861111111111 | 0 |
| 0.7805555555555556 | 0 |
| 0.78125 | 0 |
| 0.7819444444444444 | 0 |
| 0.782638888888889 | 0 |
| 0.7833333333333333 | 0 |
| 0.7840277777777778 | 0 |
| 0.7847222222222222 | 0 |
| 0.7854166666666668 | 0 |
| 0.7861111111111111 | 0 |
| 0.7868055555555555 | 0 |
| 0.7875 | 0 |
| 0.7881944444444445 | 0 |
| 0.7888888888888889 | 0 |
| 0.7895833333333333 | 0 |
| 0.7902777777777777 | 0 |
| 0.7909722222222223 | 0 |
| 0.7916666666666666 | 0 |
| 0.7923611111111111 | 0 |
| 0.7930555555555556 | 0 |
| 0.7937500000000001 | 0 |
| 0.7944444444444444 | 0 |
| 0.7951388888888888 | 0 |
| 0.7958333333333334 | 0 |
| 0.7965277777777778 | 0 |
| 0.7972222222222222 | 0 |
| 0.7979166666666666 | 0 |
| 0.7986111111111112 | 0 |
| 0.7993055555555556 | 0 |
| 0.7999999999999999 | 0 |
| 0.8006944444444444 | 0 |
| 0.8013888888888889 | 0 |
| 0.8020833333333334 | 0 |
| 0.8027777777777777 | 0 |
| 0.8034722222222223 | 0 |
| 0.8041666666666667 | 0 |
| 0.8048611111111111 | 0 |
| 0.8055555555555555 | 0 |
| 0.80625 | 0 |
| 0.8069444444444445 | 0 |
| 0.8076388888888889 | 0 |
| 0.8083333333333332 | 0 |
| 0.8090277777777778 | 0 |
| 0.8097222222222222 | 0 |
| 0.8104166666666667 | 0 |
| 0.811111111111111 | 0 |
| 0.8118055555555556 | 0 |
| 0.8125 | 0 |
| 0.8131944444444444 | 0 |
| 0.813888888888889 | 0 |
| 0.8145833333333333 | 0 |
| 0.8152777777777778 | 0 |
| 0.8159722222222222 | 0 |
| 0.8166666666666668 | 0 |
| 0.8173611111111111 | 0 |
| 0.8180555555555555 | 0 |
| 0.81875 | 0 |
| 0.8194444444444445 | 0 |
| 0.8201388888888889 | 0 |
| 0.8208333333333333 | 0 |
| 0.8215277777777777 | 0 |
| 0.8222222222222223 | 0 |
| 0.8229166666666666 | 0 |
| 0.8236111111111111 | 0 |
| 0.8243055555555556 | 0 |
| 0.8250000000000001 | 0 |
| 0.8256944444444444 | 0 |
| 0.8263888888888888 | 0 |
| 0.8270833333333334 | 0 |
| 0.8277777777777778 | 0 |
| 0.8284722222222222 | 0 |
| 0.8291666666666666 | 0 |
| 0.8298611111111112 | 0 |
| 0.8305555555555556 | 0 |
| 0.8312499999999999 | 0 |
| 0.8319444444444444 | 0 |
| 0.8326388888888889 | 0 |
| 0.8333333333333334 | 0 |
| 0.8340277777777777 | 0 |
| 0.8347222222222223 | 0 |
| 0.8354166666666667 | 0 |
| 0.8361111111111111 | 0 |
| 0.8368055555555555 | 0 |
| 0.8375 | 0 |
| 0.8381944444444445 | 0 |
| 0.8388888888888889 | 0 |
| 0.8395833333333332 | 0 |
| 0.8402777777777778 | 0 |
| 0.8409722222222222 | 0 |
| 0.8416666666666667 | 0 |
| 0.842361111111111 | 0 |
| 0.8430555555555556 | 0 |
| 0.84375 | 0 |
| 0.8444444444444444 | 0 |
| 0.845138888888889 | 0 |
| 0.8458333333333333 | 0 |
| 0.8465277777777778 | 0 |
| 0.8472222222222222 | 0 |
| 0.8479166666666668 | 0 |
| 0.8486111111111111 | 0 |
| 0.8493055555555555 | 0 |
| 0.85 | 0 |
| 0.8506944444444445 | 0 |
| 0.8513888888888889 | 0 |
| 0.8520833333333333 | 0 |
| 0.8527777777777777 | 0 |
| 0.8534722222222223 | 0 |
| 0.8541666666666666 | 0 |
| 0.8548611111111111 | 0 |
| 0.8555555555555556 | 0 |
| 0.8562500000000001 | 0 |
| 0.8569444444444444 | 0 |
| 0.8576388888888888 | 0 |
| 0.8583333333333334 | 0 |
| 0.8590277777777778 | 0 |
| 0.8597222222222222 | 0 |
| 0.8604166666666666 | 0 |
| 0.8611111111111112 | 0 |
| 0.8618055555555556 | 0 |
| 0.8624999999999999 | 0 |
| 0.8631944444444444 | 0 |
| 0.8638888888888889 | 0 |
| 0.8645833333333334 | 0 |
| 0.8652777777777777 | 0 |
| 0.8659722222222223 | 0 |
| 0.8666666666666667 | 0 |
| 0.8673611111111111 | 0 |
| 0.8680555555555555 | 0 |
| 0.86875 | 0 |
| 0.8694444444444445 | 0 |
| 0.8701388888888889 | 0 |
| 0.8708333333333332 | 0 |
| 0.8715277777777778 | 0 |
| 0.8722222222222222 | 0 |
| 0.8729166666666667 | 0 |
| 0.873611111111111 | 0 |
| 0.8743055555555556 | 0 |
| 0.875 | 0 |
| 0.8756944444444444 | 0 |
| 0.876388888888889 | 0 |
| 0.8770833333333333 | 0 |
| 0.8777777777777778 | 0 |
| 0.8784722222222222 | 0 |
| 0.8791666666666668 | 0 |
| 0.8798611111111111 | 0 |
| 0.8805555555555555 | 0 |
| 0.88125 | 0 |
| 0.8819444444444445 | 0 |
| 0.8826388888888889 | 0 |
| 0.8833333333333333 | 0 |
| 0.8840277777777777 | 0 |
| 0.8847222222222223 | 0 |
| 0.8854166666666666 | 0 |
| 0.8861111111111111 | 0 |
| 0.8868055555555556 | 0 |
| 0.8875000000000001 | 0 |
| 0.8881944444444444 | 0 |
| 0.8888888888888888 | 0 |
| 0.8895833333333334 | 0 |
| 0.8902777777777778 | 0 |
| 0.8909722222222222 | 0 |
| 0.8916666666666666 | 0 |
| 0.8923611111111112 | 0 |
| 0.8930555555555556 | 0 |
| 0.8937499999999999 | 0 |
| 0.8944444444444444 | 0 |
| 0.8951388888888889 | 0 |
| 0.8958333333333334 | 0 |
| 0.8965277777777777 | 0 |
| 0.8972222222222223 | 0 |
| 0.8979166666666667 | 0 |
| 0.8986111111111111 | 0 |
| 0.8993055555555555 | 0 |
| 0.9 | 0 |
| 0.9006944444444445 | 0 |
| 0.9013888888888889 | 0 |
| 0.9020833333333332 | 0 |
| 0.9027777777777778 | 0 |
| 0.9034722222222222 | 0 |
| 0.9041666666666667 | 0 |
| 0.904861111111111 | 0 |
| 0.9055555555555556 | 0 |
| 0.90625 | 0 |
| 0.9069444444444444 | 0 |
| 0.907638888888889 | 0 |
| 0.9083333333333333 | 0 |
| 0.9090277777777778 | 0 |
| 0.9097222222222222 | 0 |
| 0.9104166666666668 | 0 |
| 0.9111111111111111 | 0 |
| 0.9118055555555555 | 0 |
| 0.9125 | 0 |
| 0.9131944444444445 | 0 |
| 0.9138888888888889 | 0 |
| 0.9145833333333333 | 0 |
| 0.9152777777777777 | 0 |
| 0.9159722222222223 | 0 |
| 0.9166666666666666 | 0 |
| 0.9173611111111111 | 0 |
| 0.9180555555555556 | 0 |
| 0.9187500000000001 | 0 |
| 0.9194444444444444 | 0 |
| 0.9201388888888888 | 0 |
| 0.9208333333333334 | 0 |
| 0.9215277777777778 | 0 |
| 0.9222222222222222 | 0 |
| 0.9229166666666666 | 0 |
| 0.9236111111111112 | 0 |
| 0.9243055555555556 | 0 |
| 0.9249999999999999 | 0 |
| 0.9256944444444444 | 0 |
| 0.9263888888888889 | 0 |
| 0.9270833333333334 | 0 |
| 0.9277777777777777 | 0 |
| 0.9284722222222223 | 0 |
| 0.9291666666666667 | 0 |
| 0.9298611111111111 | 0 |
| 0.9305555555555555 | 0 |
| 0.93125 | 0 |
| 0.9319444444444445 | 0 |
| 0.9326388888888889 | 0 |
| 0.9333333333333332 | 0 |
| 0.9340277777777778 | 0 |
| 0.9347222222222222 | 0 |
| 0.9354166666666667 | 0 |
| 0.936111111111111 | 0 |
| 0.9368055555555556 | 0 |
| 0.9375 | 0 |
| 0.9381944444444444 | 0 |
| 0.938888888888889 | 0 |
| 0.9395833333333333 | 0 |
| 0.9402777777777778 | 0 |
| 0.9409722222222222 | 0 |
| 0.9416666666666668 | 0 |
| 0.9423611111111111 | 0 |
| 0.9430555555555555 | 0 |
| 0.94375 | 0 |
| 0.9444444444444445 | 0 |
| 0.9451388888888889 | 0 |
| 0.9458333333333333 | 0 |
| 0.9465277777777777 | 0 |
| 0.9472222222222223 | 0 |
| 0.9479166666666666 | 0 |
| 0.9486111111111111 | 0 |
| 0.9493055555555556 | 0 |
| 0.9500000000000001 | 0 |
| 0.9506944444444444 | 0 |
| 0.9513888888888888 | 0 |
| 0.9520833333333334 | 0 |
| 0.9527777777777778 | 0 |
| 0.9534722222222222 | 0 |
| 0.9541666666666666 | 0 |
| 0.9548611111111112 | 0 |
| 0.9555555555555556 | 0 |
| 0.9562499999999999 | 0 |
| 0.9569444444444444 | 0 |
| 0.9576388888888889 | 0 |
| 0.9583333333333334 | 0 |
| 0.9590277777777777 | 0 |
| 0.9597222222222223 | 0 |
| 0.9604166666666667 | 0 |
| 0.9611111111111111 | 0 |
| 0.9618055555555555 | 0 |
| 0.9625 | 0 |
| 0.9631944444444445 | 0 |
| 0.9638888888888889 | 0 |
| 0.9645833333333332 | 0 |
| 0.9652777777777778 | 0 |
| 0.9659722222222222 | 0 |
| 0.9666666666666667 | 0 |
| 0.967361111111111 | 0 |
| 0.9680555555555556 | 0 |
| 0.96875 | 0 |
| 0.9694444444444444 | 0 |
| 0.970138888888889 | 0 |
| 0.9708333333333333 | 0 |
| 0.9715277777777778 | 0 |
| 0.9722222222222222 | 0 |
| 0.9729166666666668 | 0 |
| 0.9736111111111111 | 0 |
| 0.9743055555555555 | 0 |
| 0.975 | 0 |
| 0.9756944444444445 | 0 |
| 0.9763888888888889 | 0 |
| 0.9770833333333333 | 0 |
| 0.9777777777777777 | 0 |
| 0.9784722222222223 | 0 |
| 0.9791666666666666 | 0 |
| 0.9798611111111111 | 0 |
| 0.9805555555555556 | 0 |
| 0.9812500000000001 | 0 |
| 0.9819444444444444 | 0 |
| 0.9826388888888888 | 0 |
| 0.9833333333333334 | 0 |
| 0.9840277777777778 | 0 |
| 0.9847222222222222 | 0 |
| 0.9854166666666666 | 0 |
| 0.9861111111111112 | 0 |
| 0.9868055555555556 | 0 |
| 0.9874999999999999 | 0 |
| 0.9881944444444444 | 0 |
| 0.9888888888888889 | 0 |
| 0.9895833333333334 | 0 |
| 0.9902777777777777 | 0 |
| 0.9909722222222223 | 0 |
| 0.9916666666666667 | 0 |
| 0.9923611111111111 | 0 |
| 0.9930555555555555 | 0 |
| 0.99375 | 0 |
| 0.9944444444444445 | 0 |
| 0.9951388888888889 | 0 |
| 0.9958333333333332 | 0 |
| 0.9965277777777778 | 0 |
| 0.9972222222222222 | 0 |
| 0.9979166666666667 | 0 |
| 0.998611111111111 | 0 |
| 0.9993055555555556 | 0 |